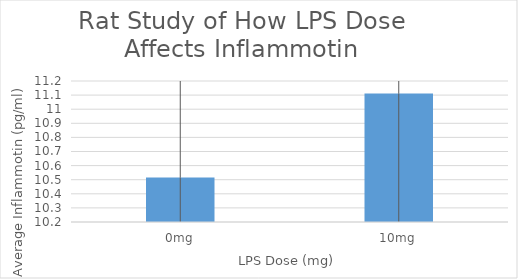
| Category | Series 0 |
|---|---|
| 0mg | 10.516 |
| 10mg | 11.112 |